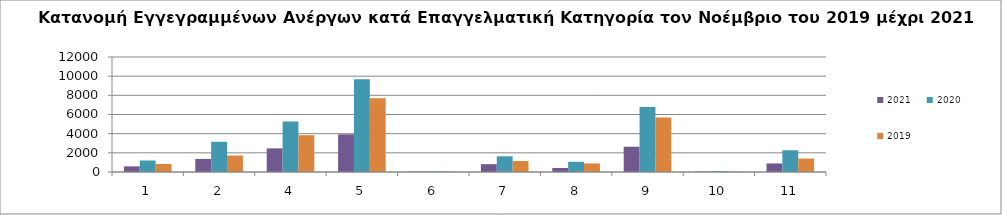
| Category | 2021 | 2020 | 2019 |
|---|---|---|---|
| 1.0 | 587 | 1200 | 840 |
| 2.0 | 1364 | 3154 | 1719 |
| 4.0 | 2465 | 5273 | 3843 |
| 5.0 | 3927 | 9667 | 7692 |
| 6.0 | 36 | 70 | 54 |
| 7.0 | 819 | 1638 | 1144 |
| 8.0 | 419 | 1066 | 893 |
| 9.0 | 2638 | 6779 | 5690 |
| 10.0 | 42 | 92 | 48 |
| 11.0 | 893 | 2268 | 1402 |